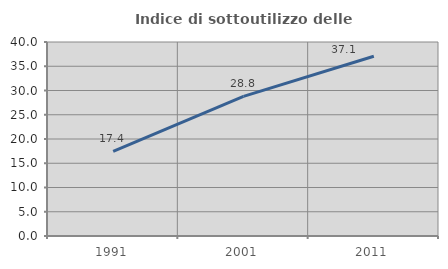
| Category | Indice di sottoutilizzo delle abitazioni  |
|---|---|
| 1991.0 | 17.45 |
| 2001.0 | 28.794 |
| 2011.0 | 37.063 |